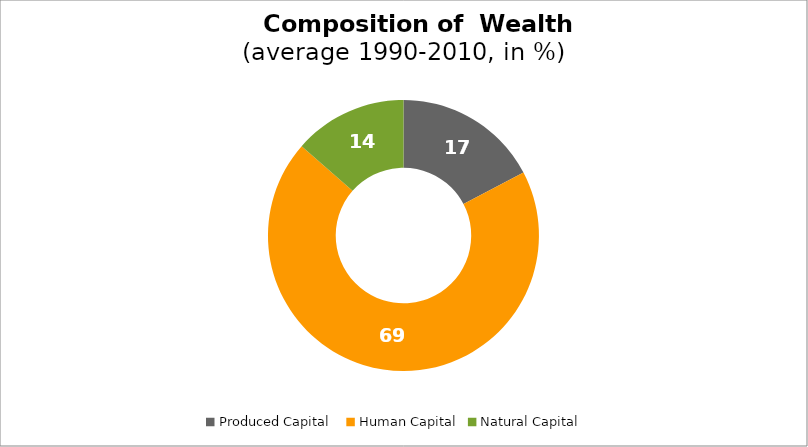
| Category | Series 0 |
|---|---|
| Produced Capital  | 17.303 |
| Human Capital | 69.157 |
| Natural Capital | 13.54 |